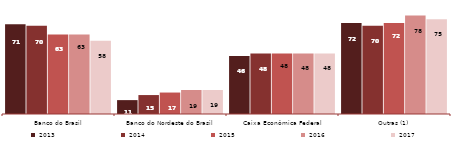
| Category | 2013 | 2014 | 2015 | 2016 | 2017 |
|---|---|---|---|---|---|
| Banco do Brasil | 71 | 70 | 63 | 63 | 58 |
| Banco do Nordeste do Brasil | 11 | 15 | 17 | 19 | 19 |
| Caixa Econômica Federal | 46 | 48 | 48 | 48 | 48 |
| Outras (1) | 72 | 70 | 72 | 78 | 75 |